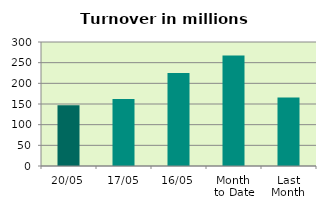
| Category | Series 0 |
|---|---|
| 20/05 | 146.859 |
| 17/05 | 161.999 |
| 16/05 | 224.952 |
| Month 
to Date | 267.233 |
| Last
Month | 165.638 |